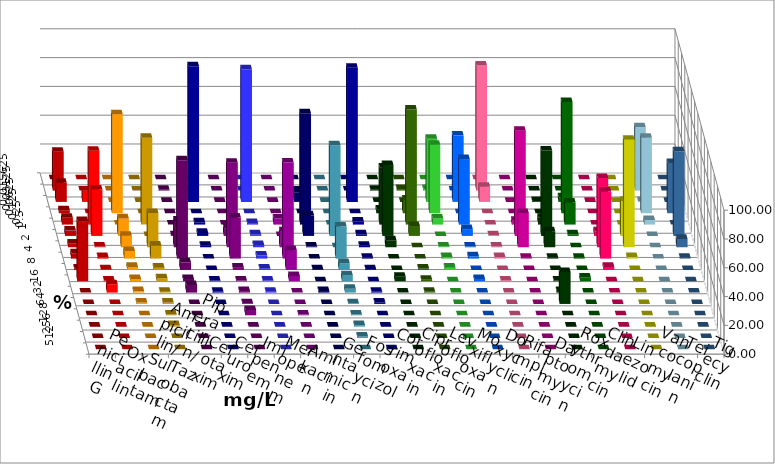
| Category | Penicillin G | Oxacillin | Ampicillin/ Sulbactam | Piperacillin/ Tazobactam | Cefotaxim | Cefuroxim | Imipenem | Meropenem | Amikacin | Gentamicin | Fosfomycin | Cotrimoxazol | Ciprofloxacin | Levofloxacin | Moxifloxacin | Doxycyclin | Rifampicin | Daptomycin | Roxythromycin | Clindamycin | Linezolid | Vancomycin | Teicoplanin | Tigecyclin |
|---|---|---|---|---|---|---|---|---|---|---|---|---|---|---|---|---|---|---|---|---|---|---|---|---|
| 0.015625 | 0 | 0 | 0 | 0 | 0 | 0 | 0 | 0 | 0 | 0 | 0 | 0 | 0 | 0 | 0 | 0 | 0 | 0 | 0 | 0 | 0 | 0 | 0 | 0 |
| 0.03125 | 26.984 | 0 | 0 | 0 | 0.529 | 0 | 0 | 0 | 0 | 0 | 0 | 0 | 0.529 | 1.058 | 1.058 | 0 | 86.772 | 0 | 0 | 0 | 0 | 0 | 0 | 43.915 |
| 0.0625 | 13.228 | 7.937 | 0 | 0 | 0 | 0 | 94.18 | 92.063 | 0 | 6.349 | 0 | 93.122 | 0 | 0 | 43.915 | 46.032 | 10.582 | 0 | 0.529 | 3.175 | 0 | 0 | 0 | 0.529 |
| 0.125 | 2.116 | 0 | 68.783 | 0 | 0 | 0 | 0 | 0 | 0 | 0 | 0 | 0 | 2.646 | 9.524 | 47.619 | 0 | 0 | 0 | 0 | 77.249 | 0 | 0 | 34.921 | 52.381 |
| 0.25 | 4.762 | 51.323 | 0 | 60.317 | 0 | 0 | 1.587 | 1.058 | 4.233 | 77.249 | 0 | 2.116 | 39.683 | 79.894 | 4.233 | 45.503 | 0 | 2.646 | 4.762 | 15.344 | 0 | 0 | 0 | 3.175 |
| 0.5 | 3.704 | 32.275 | 12.169 | 0 | 0.529 | 5.291 | 2.116 | 1.058 | 0 | 14.286 | 62.963 | 1.058 | 49.206 | 6.878 | 0 | 4.762 | 0.529 | 73.016 | 59.259 | 1.058 | 3.175 | 24.339 | 58.73 | 0 |
| 1.0 | 2.646 | 0.529 | 7.937 | 23.81 | 18.519 | 58.73 | 1.058 | 1.587 | 11.111 | 0.529 | 0 | 1.058 | 4.762 | 0 | 0.529 | 0.529 | 0.529 | 23.81 | 11.111 | 0 | 48.148 | 74.603 | 5.82 | 0 |
| 2.0 | 3.704 | 1.058 | 5.291 | 8.995 | 68.254 | 28.571 | 0 | 2.116 | 66.667 | 0 | 22.222 | 0.529 | 0 | 0 | 1.058 | 1.587 | 1.058 | 0.529 | 0.529 | 0.529 | 46.561 | 1.058 | 0.529 | 0 |
| 4.0 | 1.058 | 0.529 | 2.116 | 1.587 | 5.291 | 1.587 | 0 | 1.058 | 13.757 | 0.529 | 4.762 | 0.529 | 0 | 1.058 | 1.587 | 0 | 0 | 0 | 0 | 0 | 2.116 | 0 | 0 | 0 |
| 8.0 | 41.799 | 0.529 | 1.587 | 2.116 | 1.587 | 0.529 | 0.529 | 0.529 | 3.704 | 0 | 4.233 | 0 | 3.175 | 1.058 | 0 | 1.587 | 0.529 | 0 | 0.529 | 2.646 | 0 | 0 | 0 | 0 |
| 16.0 | 0 | 5.82 | 1.058 | 0.529 | 5.291 | 1.058 | 0.529 | 0.529 | 0 | 1.058 | 2.646 | 0.529 | 0 | 0.529 | 0 | 0 | 0 | 0 | 1.058 | 0 | 0 | 0 | 0 | 0 |
| 32.0 | 0 | 0 | 1.058 | 1.058 | 0 | 0.529 | 0 | 0 | 0 | 0 | 0.529 | 1.058 | 0 | 0 | 0 | 0 | 0 | 0 | 22.222 | 0 | 0 | 0 | 0 | 0 |
| 64.0 | 0 | 0 | 0 | 0.529 | 0 | 3.704 | 0 | 0 | 0.529 | 0 | 0.529 | 0 | 0 | 0 | 0 | 0 | 0 | 0 | 0 | 0 | 0 | 0 | 0 | 0 |
| 128.0 | 0 | 0 | 0 | 1.058 | 0 | 0 | 0 | 0 | 0 | 0 | 1.058 | 0 | 0 | 0 | 0 | 0 | 0 | 0 | 0 | 0 | 0 | 0 | 0 | 0 |
| 256.0 | 0 | 0 | 0 | 0 | 0 | 0 | 0 | 0 | 0 | 0 | 1.058 | 0 | 0 | 0 | 0 | 0 | 0 | 0 | 0 | 0 | 0 | 0 | 0 | 0 |
| 512.0 | 0 | 0 | 0 | 0 | 0 | 0 | 0 | 0 | 0 | 0 | 0 | 0 | 0 | 0 | 0 | 0 | 0 | 0 | 0 | 0 | 0 | 0 | 0 | 0 |